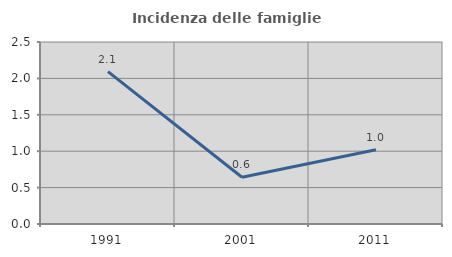
| Category | Incidenza delle famiglie numerose |
|---|---|
| 1991.0 | 2.093 |
| 2001.0 | 0.642 |
| 2011.0 | 1.02 |